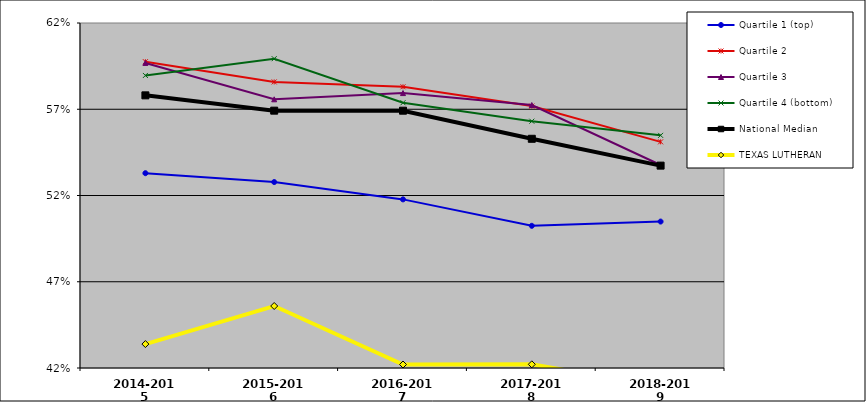
| Category | Quartile 1 (top) | Quartile 2 | Quartile 3 | Quartile 4 (bottom) | National Median | TEXAS LUTHERAN |
|---|---|---|---|---|---|---|
| 2014-2015 | 0.533 | 0.598 | 0.597 | 0.59 | 0.578 | 0.434 |
| 2015-2016 | 0.528 | 0.586 | 0.576 | 0.599 | 0.569 | 0.456 |
| 2016-2017 | 0.518 | 0.583 | 0.579 | 0.574 | 0.569 | 0.422 |
| 2017-2018 | 0.502 | 0.572 | 0.572 | 0.563 | 0.553 | 0.422 |
| 2018-2019 | 0.505 | 0.551 | 0.538 | 0.555 | 0.537 | 0.409 |